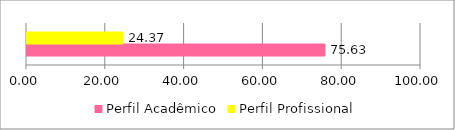
| Category | Perfil Acadêmico | Perfil Profissional |
|---|---|---|
| 0 | 75.635 | 24.365 |